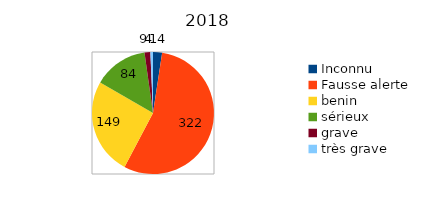
| Category | Series 0 |
|---|---|
| Inconnu | 14 |
| Fausse alerte | 322 |
| benin | 149 |
| sérieux | 84 |
| grave | 9 |
| très grave | 4 |